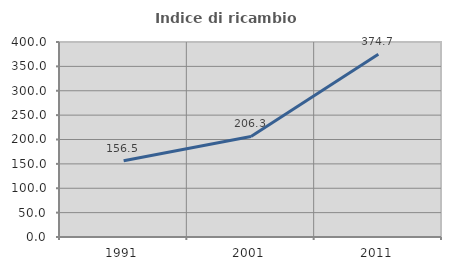
| Category | Indice di ricambio occupazionale  |
|---|---|
| 1991.0 | 156.481 |
| 2001.0 | 206.25 |
| 2011.0 | 374.684 |